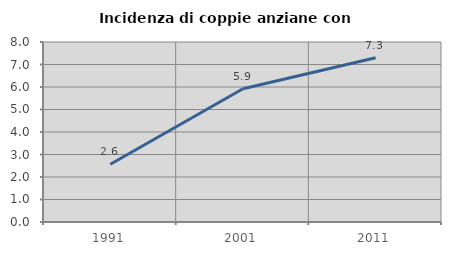
| Category | Incidenza di coppie anziane con figli |
|---|---|
| 1991.0 | 2.564 |
| 2001.0 | 5.921 |
| 2011.0 | 7.299 |